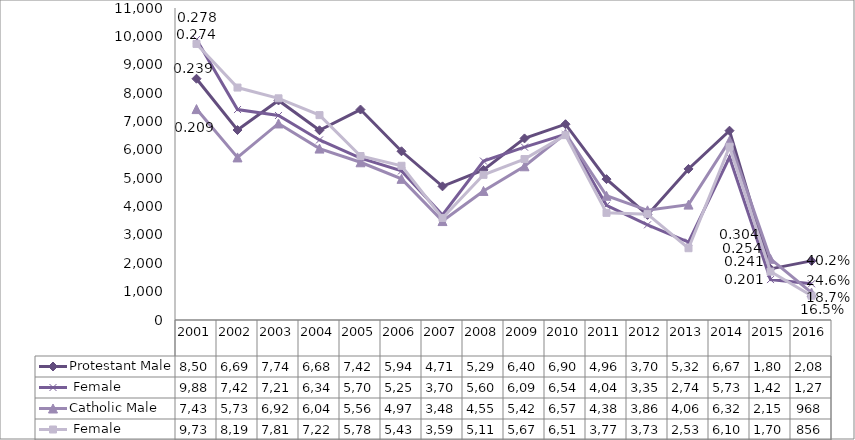
| Category | Protestant | Catholic |
|---|---|---|
| 2001.0 | 9887 | 9733 |
| 2002.0 | 7420 | 8195 |
| 2003.0 | 7211 | 7815 |
| 2004.0 | 6348 | 7223 |
| 2005.0 | 5706 | 5782 |
| 2006.0 | 5257 | 5437 |
| 2007.0 | 3701 | 3598 |
| 2008.0 | 5602 | 5118 |
| 2009.0 | 6095 | 5674 |
| 2010.0 | 6547 | 6517 |
| 2011.0 | 4042 | 3778 |
| 2012.0 | 3355 | 3732 |
| 2013.0 | 2748 | 2531 |
| 2014.0 | 5737 | 6108 |
| 2015.0 | 1425 | 1707 |
| 2016.0 | 1278 | 856 |